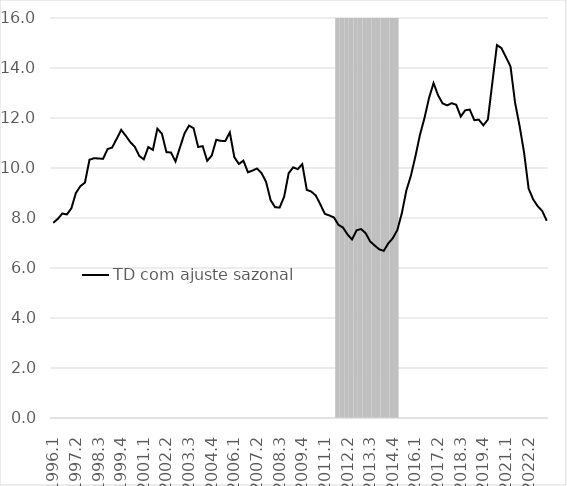
| Category | Series 2 |
|---|---|
| 1996.1 | -1 |
| 1996.2 | -1 |
| 1996.3 | -1 |
| 1996.4 | -1 |
| 1997.1 | -1 |
| 1997.2 | -1 |
| 1997.3 | -1 |
| 1997.4 | -1 |
| 1998.1 | -1 |
| 1998.2 | -1 |
| 1998.3 | -1 |
| 1998.4 | -1 |
| 1999.1 | -1 |
| 1999.2 | -1 |
| 1999.3 | -1 |
| 1999.4 | -1 |
| 2000.1 | -1 |
| 2000.2 | -1 |
| 2000.3 | -1 |
| 2000.4 | -1 |
| 2001.1 | -1 |
| 2001.2 | -1 |
| 2001.3 | -1 |
| 2001.4 | -1 |
| 2002.1 | -1 |
| 2002.2 | -1 |
| 2002.3 | -1 |
| 2002.4 | -1 |
| 2003.1 | -1 |
| 2003.2 | -1 |
| 2003.3 | -1 |
| 2003.4 | -1 |
| 2004.1 | -1 |
| 2004.2 | -1 |
| 2004.3 | -1 |
| 2004.4 | -1 |
| 2005.1 | -1 |
| 2005.2 | -1 |
| 2005.3 | -1 |
| 2005.4 | -1 |
| 2006.1 | -1 |
| 2006.2 | -1 |
| 2006.3 | -1 |
| 2006.4 | -1 |
| 2007.1 | -1 |
| 2007.2 | -1 |
| 2007.3 | -1 |
| 2007.4 | -1 |
| 2008.1 | -1 |
| 2008.2 | -1 |
| 2008.3 | -1 |
| 2008.4 | -1 |
| 2009.1 | -1 |
| 2009.2 | -1 |
| 2009.3 | -1 |
| 2009.4 | -1 |
| 2010.1 | -1 |
| 2010.2 | -1 |
| 2010.3 | -1 |
| 2010.4 | -1 |
| 2011.1 | -1 |
| 2011.2 | -1 |
| 2011.3 | -1 |
| 2011.4 | 100 |
| 2012.1 | 100 |
| 2012.2 | 100 |
| 2012.3 | 100 |
| 2012.4 | 100 |
| 2013.1 | 100 |
| 2013.2 | 100 |
| 2013.3 | 100 |
| 2013.4 | 100 |
| 2014.1 | 100 |
| 2014.2 | 100 |
| 2014.3 | 100 |
| 2014.4 | 100 |
| 2015.1 | 100 |
| 2015.2 | -1 |
| 2015.3 | -1 |
| 2015.4 | -1 |
| 2016.1 | -1 |
| 2016.2 | -1 |
| 2016.3 | -1 |
| 2016.4 | -1 |
| 2017.1 | -1 |
| 2017.2 | -1 |
| 2017.3 | -1 |
| 2017.4 | -1 |
| 2018.1 | -1 |
| 2018.2 | -1 |
| 2018.3 | -1 |
| 2018.4 | -1 |
| 2019.1 | -1 |
| 2019.2 | -1 |
| 2019.3 | -1 |
| 2019.4 | -1 |
| 2020.1 | -1 |
| 2020.2 | -1 |
| 2020.3 | -1 |
| 2020.4 | -1 |
| 2021.1 | -1 |
| 2021.2 | -1 |
| 2021.3 | -1 |
| 2021.4 | -1 |
| 2022.1 | -1 |
| 2022.2 | -1 |
| 2022.3 | -1 |
| 2022.4 | -1 |
| 2023.1 | -1 |
| 2023.2 | -1 |